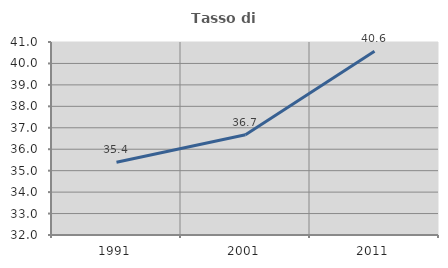
| Category | Tasso di occupazione   |
|---|---|
| 1991.0 | 35.389 |
| 2001.0 | 36.675 |
| 2011.0 | 40.563 |